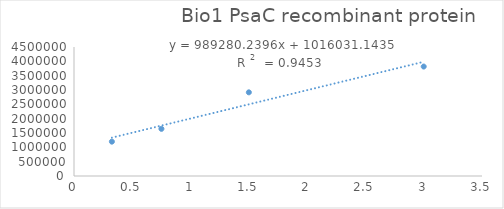
| Category | Series 0 |
|---|---|
| 3.0 | 3818036.41 |
| 1.5 | 2918488.7 |
| 0.75 | 1644646.92 |
| 0.325 | 1198189.88 |